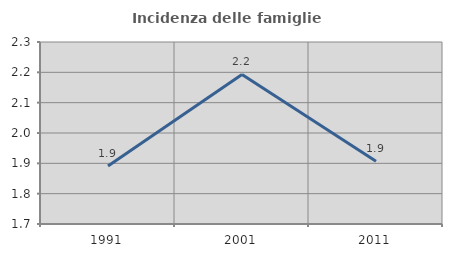
| Category | Incidenza delle famiglie numerose |
|---|---|
| 1991.0 | 1.891 |
| 2001.0 | 2.193 |
| 2011.0 | 1.907 |